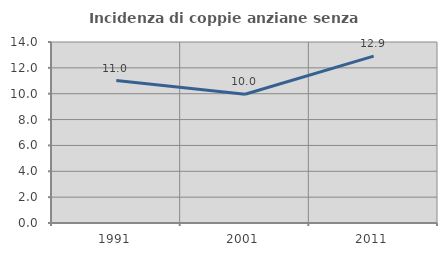
| Category | Incidenza di coppie anziane senza figli  |
|---|---|
| 1991.0 | 11.013 |
| 2001.0 | 9.961 |
| 2011.0 | 12.903 |